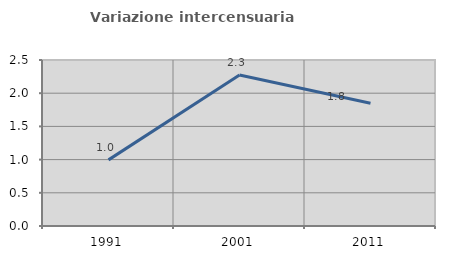
| Category | Variazione intercensuaria annua |
|---|---|
| 1991.0 | 0.996 |
| 2001.0 | 2.273 |
| 2011.0 | 1.848 |